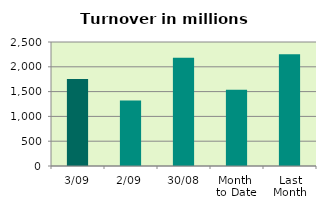
| Category | Series 0 |
|---|---|
| 3/09 | 1753.496 |
| 2/09 | 1321.203 |
| 30/08 | 2181.474 |
| Month 
to Date | 1537.349 |
| Last
Month | 2251.437 |